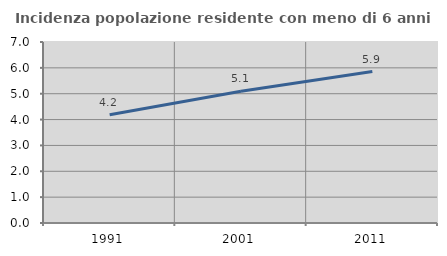
| Category | Incidenza popolazione residente con meno di 6 anni |
|---|---|
| 1991.0 | 4.186 |
| 2001.0 | 5.099 |
| 2011.0 | 5.857 |